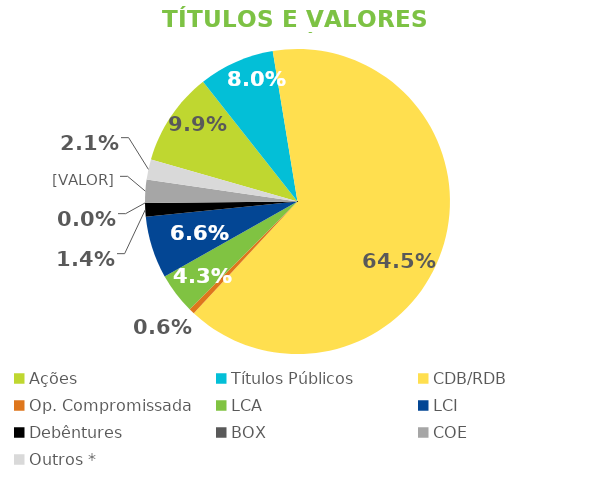
| Category | TVM |
|---|---|
| Ações | 0.099 |
| Títulos Públicos | 0.08 |
| CDB/RDB | 0.645 |
| Op. Compromissada | 0.006 |
| LCA | 0.043 |
| LCI | 0.066 |
| Debêntures | 0.014 |
| BOX | 0 |
| COE | 0.025 |
| Outros * | 0.021 |